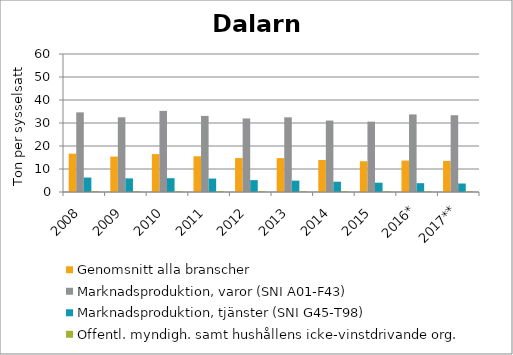
| Category | Genomsnitt alla branscher | Marknadsproduktion, varor (SNI A01-F43) | Marknadsproduktion, tjänster (SNI G45-T98) | Offentl. myndigh. samt hushållens icke-vinstdrivande org. |
|---|---|---|---|---|
| 2008 | 16.669 | 34.628 | 6.279 | 0.416 |
| 2009 | 15.399 | 32.478 | 5.919 | 0.376 |
| 2010 | 16.478 | 35.273 | 6.004 | 0.395 |
| 2011 | 15.529 | 33.075 | 5.85 | 0.38 |
| 2012 | 14.766 | 31.978 | 5.162 | 0.377 |
| 2013 | 14.737 | 32.474 | 4.943 | 0.358 |
| 2014 | 13.922 | 31.064 | 4.472 | 0.335 |
| 2015 | 13.379 | 30.599 | 4.044 | 0.326 |
| 2016* | 13.666 | 33.731 | 3.835 | 0.314 |
| 2017** | 13.52 | 33.384 | 3.694 | 0.301 |